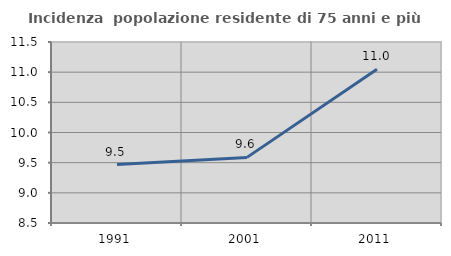
| Category | Incidenza  popolazione residente di 75 anni e più |
|---|---|
| 1991.0 | 9.468 |
| 2001.0 | 9.588 |
| 2011.0 | 11.049 |